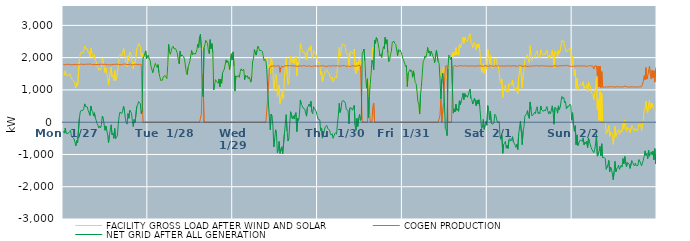
| Category | FACILITY GROSS LOAD AFTER WIND AND SOLAR | COGEN PRODUCTION | NET GRID AFTER ALL GENERATION |
|---|---|---|---|
|  Mon  1/27 | 1504 | 1786 | -282 |
|  Mon  1/27 | 1460 | 1801 | -341 |
|  Mon  1/27 | 1595 | 1778 | -183 |
|  Mon  1/27 | 1453 | 1793 | -340 |
|  Mon  1/27 | 1480 | 1795 | -315 |
|  Mon  1/27 | 1436 | 1794 | -358 |
|  Mon  1/27 | 1418 | 1795 | -377 |
|  Mon  1/27 | 1501 | 1792 | -291 |
|  Mon  1/27 | 1524 | 1777 | -253 |
|  Mon  1/27 | 1365 | 1798 | -433 |
|  Mon  1/27 | 1318 | 1782 | -464 |
|  Mon  1/27 | 1316 | 1795 | -479 |
|  Mon  1/27 | 1270 | 1786 | -516 |
|  Mon  1/27 | 1169 | 1783 | -614 |
|  Mon  1/27 | 1060 | 1790 | -730 |
|  Mon  1/27 | 1220 | 1790 | -570 |
|  Mon  1/27 | 1140 | 1777 | -637 |
|  Mon  1/27 | 1158 | 1802 | -644 |
|  Mon  1/27 | 1900 | 1782 | 118 |
|  Mon  1/27 | 2116 | 1803 | 313 |
|  Mon  1/27 | 2165 | 1803 | 362 |
|  Mon  1/27 | 2146 | 1793 | 353 |
|  Mon  1/27 | 2154 | 1788 | 366 |
|  Mon  1/27 | 2221 | 1800 | 421 |
|  Mon  1/27 | 2360 | 1792 | 568 |
|  Mon  1/27 | 2276 | 1791 | 485 |
|  Mon  1/27 | 2289 | 1799 | 490 |
|  Mon  1/27 | 2272 | 1801 | 471 |
|  Mon  1/27 | 2152 | 1792 | 360 |
|  Mon  1/27 | 2184 | 1797 | 387 |
|  Mon  1/27 | 2015 | 1806 | 209 |
|  Mon  1/27 | 2288 | 1787 | 501 |
|  Mon  1/27 | 2160 | 1789 | 371 |
|  Mon  1/27 | 2145 | 1806 | 339 |
|  Mon  1/27 | 1983 | 1783 | 200 |
|  Mon  1/27 | 2093 | 1801 | 292 |
|  Mon  1/27 | 1933 | 1787 | 146 |
|  Mon  1/27 | 1869 | 1809 | 60 |
|  Mon  1/27 | 1744 | 1783 | -39 |
|  Mon  1/27 | 1700 | 1793 | -93 |
|  Mon  1/27 | 1603 | 1784 | -181 |
|  Mon  1/27 | 1677 | 1795 | -118 |
|  Mon  1/27 | 1624 | 1798 | -174 |
|  Mon  1/27 | 1698 | 1776 | -78 |
|  Mon  1/27 | 1984 | 1792 | 192 |
|  Mon  1/27 | 1909 | 1789 | 120 |
|  Mon  1/27 | 1906 | 1793 | 113 |
|  Mon  1/27 | 1536 | 1787 | -251 |
|  Mon  1/27 | 1676 | 1794 | -118 |
|  Mon  1/27 | 1542 | 1802 | -260 |
|  Mon  1/27 | 1381 | 1776 | -395 |
|  Mon  1/27 | 1149 | 1784 | -635 |
|  Mon  1/27 | 1384 | 1777 | -393 |
|  Mon  1/27 | 1375 | 1792 | -417 |
|  Mon  1/27 | 1698 | 1780 | -82 |
|  Mon  1/27 | 1399 | 1792 | -393 |
|  Mon  1/27 | 1448 | 1790 | -342 |
|  Mon  1/27 | 1289 | 1790 | -501 |
|  Mon  1/27 | 1596 | 1792 | -196 |
|  Mon  1/27 | 1289 | 1802 | -513 |
|  Mon  1/27 | 1335 | 1797 | -462 |
|  Mon  1/27 | 1357 | 1783 | -426 |
|  Mon  1/27 | 1720 | 1793 | -73 |
|  Mon  1/27 | 1966 | 1783 | 183 |
|  Mon  1/27 | 2094 | 1780 | 314 |
|  Mon  1/27 | 2105 | 1800 | 305 |
|  Mon  1/27 | 2051 | 1784 | 267 |
|  Mon  1/27 | 2140 | 1795 | 345 |
|  Mon  1/27 | 2293 | 1800 | 493 |
|  Mon  1/27 | 2160 | 1797 | 363 |
|  Mon  1/27 | 1927 | 1801 | 126 |
|  Mon  1/27 | 1786 | 1802 | -16 |
|  Mon  1/27 | 1724 | 1786 | -62 |
|  Mon  1/27 | 2058 | 1790 | 268 |
|  Mon  1/27 | 1910 | 1789 | 121 |
|  Mon  1/27 | 2172 | 1801 | 371 |
|  Mon  1/27 | 2191 | 1795 | 396 |
|  Mon  1/27 | 2076 | 1799 | 277 |
|  Mon  1/27 | 1802 | 1769 | 33 |
|  Mon  1/27 | 1661 | 1794 | -133 |
|  Mon  1/27 | 1873 | 1790 | 83 |
|  Mon  1/27 | 1786 | 1796 | -10 |
|  Mon  1/27 | 1795 | 1801 | -6 |
|  Mon  1/27 | 2278 | 1788 | 490 |
|  Mon  1/27 | 2317 | 1781 | 536 |
|  Mon  1/27 | 2437 | 1796 | 641 |
|  Mon  1/27 | 2408 | 1791 | 617 |
|  Mon  1/27 | 2352 | 1784 | 568 |
|  Mon  1/27 | 2051 | 1787 | 264 |
|  Mon  1/27 | 2142 | 1788 | 354 |
|  Mon  1/27 | 1989 | 0 | 1989 |
|  Mon  1/27 | 2026 | 0 | 2026 |
|  Mon  1/27 | 2132 | 0 | 2132 |
|  Mon  1/27 | 2210 | 0 | 2210 |
|  Mon  1/27 | 1965 | 0 | 1965 |
|  Mon  1/27 | 1989 | 0 | 1989 |
|  Tue  1/28 | 2079 | 0 | 2079 |
|  Tue  1/28 | 1953 | 0 | 1953 |
|  Tue  1/28 | 1918 | 0 | 1918 |
|  Tue  1/28 | 1740 | 0 | 1740 |
|  Tue  1/28 | 1732 | 0 | 1732 |
|  Tue  1/28 | 1534 | 0 | 1534 |
|  Tue  1/28 | 1652 | 0 | 1652 |
|  Tue  1/28 | 1634 | 0 | 1634 |
|  Tue  1/28 | 1823 | 0 | 1823 |
|  Tue  1/28 | 1746 | 0 | 1746 |
|  Tue  1/28 | 1694 | 0 | 1694 |
|  Tue  1/28 | 1786 | 0 | 1786 |
|  Tue  1/28 | 1534 | 0 | 1534 |
|  Tue  1/28 | 1407 | 0 | 1407 |
|  Tue  1/28 | 1294 | 0 | 1294 |
|  Tue  1/28 | 1309 | 0 | 1309 |
|  Tue  1/28 | 1302 | 0 | 1302 |
|  Tue  1/28 | 1411 | 0 | 1411 |
|  Tue  1/28 | 1384 | 0 | 1384 |
|  Tue  1/28 | 1446 | 0 | 1446 |
|  Tue  1/28 | 1441 | 0 | 1441 |
|  Tue  1/28 | 1348 | 0 | 1348 |
|  Tue  1/28 | 1754 | 0 | 1754 |
|  Tue  1/28 | 2413 | 0 | 2413 |
|  Tue  1/28 | 2179 | 0 | 2179 |
|  Tue  1/28 | 2102 | 0 | 2102 |
|  Tue  1/28 | 2214 | 0 | 2214 |
|  Tue  1/28 | 2313 | 0 | 2313 |
|  Tue  1/28 | 2353 | 0 | 2353 |
|  Tue  1/28 | 2280 | 0 | 2280 |
|  Tue  1/28 | 2281 | 0 | 2281 |
|  Tue  1/28 | 2275 | 0 | 2275 |
|  Tue  1/28 | 2277 | 0 | 2277 |
|  Tue  1/28 | 2116 | 0 | 2116 |
|  Tue  1/28 | 1910 | 0 | 1910 |
|  Tue  1/28 | 1806 | 0 | 1806 |
|  Tue  1/28 | 2198 | 0 | 2198 |
|  Tue  1/28 | 2042 | 0 | 2042 |
|  Tue  1/28 | 2085 | 0 | 2085 |
|  Tue  1/28 | 2070 | 0 | 2070 |
|  Tue  1/28 | 2025 | 0 | 2025 |
|  Tue  1/28 | 1950 | 0 | 1950 |
|  Tue  1/28 | 1954 | 0 | 1954 |
|  Tue  1/28 | 1542 | 0 | 1542 |
|  Tue  1/28 | 1476 | 0 | 1476 |
|  Tue  1/28 | 1701 | 0 | 1701 |
|  Tue  1/28 | 1714 | 0 | 1714 |
|  Tue  1/28 | 1886 | 0 | 1886 |
|  Tue  1/28 | 2052 | 0 | 2052 |
|  Tue  1/28 | 2220 | 0 | 2220 |
|  Tue  1/28 | 2084 | 0 | 2084 |
|  Tue  1/28 | 2142 | 0 | 2142 |
|  Tue  1/28 | 2135 | 0 | 2135 |
|  Tue  1/28 | 2105 | 0 | 2105 |
|  Tue  1/28 | 2155 | 0 | 2155 |
|  Tue  1/28 | 2248 | 0 | 2248 |
|  Tue  1/28 | 2418 | 0 | 2418 |
|  Tue  1/28 | 2314 | 0 | 2314 |
|  Tue  1/28 | 2639 | 0 | 2639 |
|  Tue  1/28 | 2729 | 0 | 2729 |
|  Tue  1/28 | 2547 | 247 | 2300 |
|  Tue  1/28 | 2242 | 1146 | 1096 |
|  Tue  1/28 | 2290 | 1498 | 792 |
|  Tue  1/28 | 2317 | 0 | 2317 |
|  Tue  1/28 | 2391 | 0 | 2391 |
|  Tue  1/28 | 2537 | 0 | 2537 |
|  Tue  1/28 | 2512 | 0 | 2512 |
|  Tue  1/28 | 2445 | 0 | 2445 |
|  Tue  1/28 | 2199 | 0 | 2199 |
|  Tue  1/28 | 2120 | 0 | 2120 |
|  Tue  1/28 | 2559 | 0 | 2559 |
|  Tue  1/28 | 2274 | 0 | 2274 |
|  Tue  1/28 | 2437 | 0 | 2437 |
|  Tue  1/28 | 2160 | 0 | 2160 |
|  Tue  1/28 | 1002 | 0 | 1002 |
|  Tue  1/28 | 1148 | 0 | 1148 |
|  Tue  1/28 | 1318 | 0 | 1318 |
|  Tue  1/28 | 1275 | 0 | 1275 |
|  Tue  1/28 | 1234 | 0 | 1234 |
|  Tue  1/28 | 1201 | 0 | 1201 |
|  Tue  1/28 | 1341 | 0 | 1341 |
|  Tue  1/28 | 1093 | 0 | 1093 |
|  Tue  1/28 | 1337 | 0 | 1337 |
|  Tue  1/28 | 1206 | 0 | 1206 |
|  Tue  1/28 | 1527 | 0 | 1527 |
|  Tue  1/28 | 1527 | 0 | 1527 |
|  Tue  1/28 | 1647 | 0 | 1647 |
|  Tue  1/28 | 1622 | 0 | 1622 |
|  Tue  1/28 | 1932 | 0 | 1932 |
|  Tue  1/28 | 1847 | 0 | 1847 |
|  Tue  1/28 | 1905 | 0 | 1905 |
|  Tue  1/28 | 1803 | 0 | 1803 |
|  Tue  1/28 | 1626 | 0 | 1626 |
|  Tue  1/28 | 1602 | 0 | 1602 |
|  Tue  1/28 | 2117 | 0 | 2117 |
|  Tue  1/28 | 1936 | 0 | 1936 |
|  Wed  1/29 | 2178 | 0 | 2178 |
|  Wed  1/29 | 1743 | 0 | 1743 |
|  Wed  1/29 | 963 | 0 | 963 |
|  Wed  1/29 | 1437 | 0 | 1437 |
|  Wed  1/29 | 1397 | 0 | 1397 |
|  Wed  1/29 | 1374 | 0 | 1374 |
|  Wed  1/29 | 1450 | 0 | 1450 |
|  Wed  1/29 | 1388 | 0 | 1388 |
|  Wed  1/29 | 1566 | 0 | 1566 |
|  Wed  1/29 | 1654 | 0 | 1654 |
|  Wed  1/29 | 1595 | 0 | 1595 |
|  Wed  1/29 | 1610 | 0 | 1610 |
|  Wed  1/29 | 1638 | 0 | 1638 |
|  Wed  1/29 | 1317 | 0 | 1317 |
|  Wed  1/29 | 1456 | 0 | 1456 |
|  Wed  1/29 | 1405 | 0 | 1405 |
|  Wed  1/29 | 1441 | 0 | 1441 |
|  Wed  1/29 | 1350 | 0 | 1350 |
|  Wed  1/29 | 1403 | 0 | 1403 |
|  Wed  1/29 | 1397 | 0 | 1397 |
|  Wed  1/29 | 1241 | 0 | 1241 |
|  Wed  1/29 | 1414 | 0 | 1414 |
|  Wed  1/29 | 1864 | 0 | 1864 |
|  Wed  1/29 | 1971 | 0 | 1971 |
|  Wed  1/29 | 2249 | 0 | 2249 |
|  Wed  1/29 | 2230 | 0 | 2230 |
|  Wed  1/29 | 2078 | 0 | 2078 |
|  Wed  1/29 | 2227 | 0 | 2227 |
|  Wed  1/29 | 2359 | 0 | 2359 |
|  Wed  1/29 | 2347 | 0 | 2347 |
|  Wed  1/29 | 2217 | 0 | 2217 |
|  Wed  1/29 | 2236 | 0 | 2236 |
|  Wed  1/29 | 2221 | 0 | 2221 |
|  Wed  1/29 | 2190 | 0 | 2190 |
|  Wed  1/29 | 2053 | 0 | 2053 |
|  Wed  1/29 | 1903 | 0 | 1903 |
|  Wed  1/29 | 1950 | 0 | 1950 |
|  Wed  1/29 | 1909 | 0 | 1909 |
|  Wed  1/29 | 1983 | 344 | 1639 |
|  Wed  1/29 | 1819 | 742 | 1077 |
|  Wed  1/29 | 1676 | 1146 | 530 |
|  Wed  1/29 | 1780 | 1639 | 141 |
|  Wed  1/29 | 1493 | 1730 | -237 |
|  Wed  1/29 | 1992 | 1740 | 252 |
|  Wed  1/29 | 1914 | 1735 | 179 |
|  Wed  1/29 | 1617 | 1738 | -121 |
|  Wed  1/29 | 983 | 1751 | -768 |
|  Wed  1/29 | 1232 | 1747 | -515 |
|  Wed  1/29 | 1497 | 1731 | -234 |
|  Wed  1/29 | 1405 | 1750 | -345 |
|  Wed  1/29 | 797 | 1745 | -948 |
|  Wed  1/29 | 905 | 1743 | -838 |
|  Wed  1/29 | 1151 | 1749 | -598 |
|  Wed  1/29 | 579 | 1546 | -967 |
|  Wed  1/29 | 697 | 1689 | -992 |
|  Wed  1/29 | 972 | 1738 | -766 |
|  Wed  1/29 | 758 | 1737 | -979 |
|  Wed  1/29 | 715 | 1709 | -994 |
|  Wed  1/29 | 1391 | 1744 | -353 |
|  Wed  1/29 | 1672 | 1737 | -65 |
|  Wed  1/29 | 1981 | 1749 | 232 |
|  Wed  1/29 | 1467 | 1741 | -274 |
|  Wed  1/29 | 1164 | 1749 | -585 |
|  Wed  1/29 | 1241 | 1745 | -504 |
|  Wed  1/29 | 1687 | 1750 | -63 |
|  Wed  1/29 | 2058 | 1734 | 324 |
|  Wed  1/29 | 2061 | 1749 | 312 |
|  Wed  1/29 | 1852 | 1742 | 110 |
|  Wed  1/29 | 1944 | 1747 | 197 |
|  Wed  1/29 | 1825 | 1729 | 96 |
|  Wed  1/29 | 1981 | 1744 | 237 |
|  Wed  1/29 | 2047 | 1750 | 297 |
|  Wed  1/29 | 1439 | 1731 | -292 |
|  Wed  1/29 | 1856 | 1736 | 120 |
|  Wed  1/29 | 1790 | 1738 | 52 |
|  Wed  1/29 | 1962 | 1737 | 225 |
|  Wed  1/29 | 2438 | 1748 | 690 |
|  Wed  1/29 | 2312 | 1758 | 554 |
|  Wed  1/29 | 2249 | 1732 | 517 |
|  Wed  1/29 | 2170 | 1731 | 439 |
|  Wed  1/29 | 2199 | 1765 | 434 |
|  Wed  1/29 | 2146 | 1740 | 406 |
|  Wed  1/29 | 2019 | 1733 | 286 |
|  Wed  1/29 | 1923 | 1737 | 186 |
|  Wed  1/29 | 2197 | 1737 | 460 |
|  Wed  1/29 | 2233 | 1735 | 498 |
|  Wed  1/29 | 2314 | 1749 | 565 |
|  Wed  1/29 | 2223 | 1738 | 485 |
|  Wed  1/29 | 2371 | 1724 | 647 |
|  Wed  1/29 | 2053 | 1729 | 324 |
|  Wed  1/29 | 1993 | 1733 | 260 |
|  Wed  1/29 | 2224 | 1744 | 480 |
|  Wed  1/29 | 2164 | 1742 | 422 |
|  Wed  1/29 | 2134 | 1734 | 400 |
|  Wed  1/29 | 2079 | 1744 | 335 |
|  Wed  1/29 | 1950 | 1739 | 211 |
|  Thu  1/30 | 1831 | 1730 | 101 |
|  Thu  1/30 | 1871 | 1756 | 115 |
|  Thu  1/30 | 1818 | 1745 | 73 |
|  Thu  1/30 | 1475 | 1738 | -263 |
|  Thu  1/30 | 1563 | 1742 | -179 |
|  Thu  1/30 | 1250 | 1744 | -494 |
|  Thu  1/30 | 1365 | 1752 | -387 |
|  Thu  1/30 | 1448 | 1739 | -291 |
|  Thu  1/30 | 1578 | 1733 | -155 |
|  Thu  1/30 | 1571 | 1744 | -173 |
|  Thu  1/30 | 1627 | 1729 | -102 |
|  Thu  1/30 | 1545 | 1745 | -200 |
|  Thu  1/30 | 1522 | 1749 | -227 |
|  Thu  1/30 | 1495 | 1737 | -242 |
|  Thu  1/30 | 1377 | 1731 | -354 |
|  Thu  1/30 | 1339 | 1741 | -402 |
|  Thu  1/30 | 1396 | 1753 | -357 |
|  Thu  1/30 | 1244 | 1745 | -501 |
|  Thu  1/30 | 1309 | 1743 | -434 |
|  Thu  1/30 | 1379 | 1736 | -357 |
|  Thu  1/30 | 1420 | 1744 | -324 |
|  Thu  1/30 | 1365 | 1739 | -374 |
|  Thu  1/30 | 1708 | 1748 | -40 |
|  Thu  1/30 | 1962 | 1747 | 215 |
|  Thu  1/30 | 2320 | 1738 | 582 |
|  Thu  1/30 | 2044 | 1743 | 301 |
|  Thu  1/30 | 2151 | 1737 | 414 |
|  Thu  1/30 | 2385 | 1756 | 629 |
|  Thu  1/30 | 2423 | 1752 | 671 |
|  Thu  1/30 | 2430 | 1736 | 694 |
|  Thu  1/30 | 2392 | 1752 | 640 |
|  Thu  1/30 | 2317 | 1736 | 581 |
|  Thu  1/30 | 2125 | 1729 | 396 |
|  Thu  1/30 | 2154 | 1742 | 412 |
|  Thu  1/30 | 2100 | 1741 | 359 |
|  Thu  1/30 | 1695 | 1745 | -50 |
|  Thu  1/30 | 2169 | 1726 | 443 |
|  Thu  1/30 | 2193 | 1729 | 464 |
|  Thu  1/30 | 2180 | 1742 | 438 |
|  Thu  1/30 | 2116 | 1745 | 371 |
|  Thu  1/30 | 2151 | 1751 | 400 |
|  Thu  1/30 | 2267 | 1747 | 520 |
|  Thu  1/30 | 1628 | 1733 | -105 |
|  Thu  1/30 | 1504 | 1756 | -252 |
|  Thu  1/30 | 1854 | 1740 | 114 |
|  Thu  1/30 | 1607 | 1739 | -132 |
|  Thu  1/30 | 1883 | 1764 | 119 |
|  Thu  1/30 | 1976 | 1736 | 240 |
|  Thu  1/30 | 1794 | 1739 | 55 |
|  Thu  1/30 | 1832 | 1742 | 90 |
|  Thu  1/30 | 2138 | 0 | 2138 |
|  Thu  1/30 | 2181 | 0 | 2181 |
|  Thu  1/30 | 2266 | 0 | 2266 |
|  Thu  1/30 | 1905 | 0 | 1905 |
|  Thu  1/30 | 1365 | 0 | 1365 |
|  Thu  1/30 | 1055 | 0 | 1055 |
|  Thu  1/30 | 1343 | 0 | 1343 |
|  Thu  1/30 | 775 | 640 | 135 |
|  Thu  1/30 | 1279 | 493 | 786 |
|  Thu  1/30 | 1158 | 0 | 1158 |
|  Thu  1/30 | 1495 | 0 | 1495 |
|  Thu  1/30 | 1916 | 0 | 1916 |
|  Thu  1/30 | 2332 | 487 | 1845 |
|  Thu  1/30 | 2217 | 594 | 1623 |
|  Thu  1/30 | 2539 | 0 | 2539 |
|  Thu  1/30 | 2441 | 0 | 2441 |
|  Thu  1/30 | 2624 | 0 | 2624 |
|  Thu  1/30 | 2582 | 0 | 2582 |
|  Thu  1/30 | 2567 | 0 | 2567 |
|  Thu  1/30 | 2290 | 0 | 2290 |
|  Thu  1/30 | 2046 | 0 | 2046 |
|  Thu  1/30 | 2107 | 0 | 2107 |
|  Thu  1/30 | 2007 | 0 | 2007 |
|  Thu  1/30 | 2209 | 0 | 2209 |
|  Thu  1/30 | 2344 | 0 | 2344 |
|  Thu  1/30 | 2278 | 0 | 2278 |
|  Thu  1/30 | 2632 | 0 | 2632 |
|  Thu  1/30 | 2430 | 0 | 2430 |
|  Thu  1/30 | 2557 | 0 | 2557 |
|  Thu  1/30 | 2155 | 0 | 2155 |
|  Thu  1/30 | 1869 | 0 | 1869 |
|  Thu  1/30 | 1923 | 0 | 1923 |
|  Thu  1/30 | 2102 | 0 | 2102 |
|  Thu  1/30 | 2198 | 0 | 2198 |
|  Thu  1/30 | 2478 | 0 | 2478 |
|  Thu  1/30 | 2505 | 0 | 2505 |
|  Thu  1/30 | 2505 | 0 | 2505 |
|  Thu  1/30 | 2437 | 0 | 2437 |
|  Thu  1/30 | 2404 | 0 | 2404 |
|  Thu  1/30 | 2233 | 0 | 2233 |
|  Thu  1/30 | 2061 | 0 | 2061 |
|  Thu  1/30 | 2250 | 0 | 2250 |
|  Thu  1/30 | 2193 | 0 | 2193 |
|  Thu  1/30 | 2230 | 0 | 2230 |
|  Thu  1/30 | 2161 | 0 | 2161 |
|  Thu  1/30 | 2091 | 0 | 2091 |
|  Fri  1/31 | 1975 | 0 | 1975 |
|  Fri  1/31 | 1982 | 0 | 1982 |
|  Fri  1/31 | 1834 | 0 | 1834 |
|  Fri  1/31 | 1724 | 0 | 1724 |
|  Fri  1/31 | 1758 | 0 | 1758 |
|  Fri  1/31 | 1103 | 0 | 1103 |
|  Fri  1/31 | 1526 | 0 | 1526 |
|  Fri  1/31 | 1522 | 0 | 1522 |
|  Fri  1/31 | 1631 | 0 | 1631 |
|  Fri  1/31 | 1565 | 0 | 1565 |
|  Fri  1/31 | 1606 | 0 | 1606 |
|  Fri  1/31 | 1392 | 0 | 1392 |
|  Fri  1/31 | 1589 | 0 | 1589 |
|  Fri  1/31 | 1423 | 0 | 1423 |
|  Fri  1/31 | 1220 | 0 | 1220 |
|  Fri  1/31 | 1189 | 0 | 1189 |
|  Fri  1/31 | 958 | 0 | 958 |
|  Fri  1/31 | 635 | 0 | 635 |
|  Fri  1/31 | 565 | 0 | 565 |
|  Fri  1/31 | 253 | 0 | 253 |
|  Fri  1/31 | 884 | 0 | 884 |
|  Fri  1/31 | 1107 | 0 | 1107 |
|  Fri  1/31 | 1519 | 0 | 1519 |
|  Fri  1/31 | 1884 | 0 | 1884 |
|  Fri  1/31 | 1932 | 0 | 1932 |
|  Fri  1/31 | 2053 | 0 | 2053 |
|  Fri  1/31 | 2004 | 0 | 2004 |
|  Fri  1/31 | 2117 | 0 | 2117 |
|  Fri  1/31 | 2315 | 0 | 2315 |
|  Fri  1/31 | 2150 | 0 | 2150 |
|  Fri  1/31 | 2210 | 0 | 2210 |
|  Fri  1/31 | 2056 | 0 | 2056 |
|  Fri  1/31 | 2202 | 0 | 2202 |
|  Fri  1/31 | 2181 | 0 | 2181 |
|  Fri  1/31 | 2049 | 0 | 2049 |
|  Fri  1/31 | 1963 | 0 | 1963 |
|  Fri  1/31 | 1846 | 0 | 1846 |
|  Fri  1/31 | 1818 | 0 | 1818 |
|  Fri  1/31 | 2231 | 0 | 2231 |
|  Fri  1/31 | 2210 | 0 | 2210 |
|  Fri  1/31 | 1872 | 0 | 1872 |
|  Fri  1/31 | 1825 | 0 | 1825 |
|  Fri  1/31 | 1574 | 217 | 1357 |
|  Fri  1/31 | 1403 | 692 | 711 |
|  Fri  1/31 | 1327 | 0 | 1327 |
|  Fri  1/31 | 1520 | 0 | 1520 |
|  Fri  1/31 | 1714 | 575 | 1139 |
|  Fri  1/31 | 1743 | 1105 | 638 |
|  Fri  1/31 | 1532 | 1729 | -197 |
|  Fri  1/31 | 1505 | 1744 | -239 |
|  Fri  1/31 | 1339 | 1757 | -418 |
|  Fri  1/31 | 1649 | 0 | 1649 |
|  Fri  1/31 | 2079 | 0 | 2079 |
|  Fri  1/31 | 2028 | 0 | 2028 |
|  Fri  1/31 | 1938 | 0 | 1938 |
|  Fri  1/31 | 2020 | 0 | 2020 |
|  Fri  1/31 | 2150 | 988 | 1162 |
|  Fri  1/31 | 2013 | 1734 | 279 |
|  Fri  1/31 | 2170 | 1757 | 413 |
|  Fri  1/31 | 2077 | 1756 | 321 |
|  Fri  1/31 | 2306 | 1748 | 558 |
|  Fri  1/31 | 2098 | 1730 | 368 |
|  Fri  1/31 | 2159 | 1745 | 414 |
|  Fri  1/31 | 2077 | 1740 | 337 |
|  Fri  1/31 | 2419 | 1756 | 663 |
|  Fri  1/31 | 2302 | 1756 | 546 |
|  Fri  1/31 | 2397 | 1736 | 661 |
|  Fri  1/31 | 2500 | 1740 | 760 |
|  Fri  1/31 | 2629 | 1732 | 897 |
|  Fri  1/31 | 2439 | 1740 | 699 |
|  Fri  1/31 | 2633 | 1748 | 885 |
|  Fri  1/31 | 2546 | 1754 | 792 |
|  Fri  1/31 | 2569 | 1736 | 833 |
|  Fri  1/31 | 2504 | 1735 | 769 |
|  Fri  1/31 | 2591 | 1749 | 842 |
|  Fri  1/31 | 2692 | 1740 | 952 |
|  Fri  1/31 | 2747 | 1725 | 1022 |
|  Fri  1/31 | 2476 | 1742 | 734 |
|  Fri  1/31 | 2444 | 1748 | 696 |
|  Fri  1/31 | 2308 | 1746 | 562 |
|  Fri  1/31 | 2401 | 1749 | 652 |
|  Fri  1/31 | 2480 | 1736 | 744 |
|  Fri  1/31 | 2472 | 1735 | 737 |
|  Fri  1/31 | 2245 | 1736 | 509 |
|  Fri  1/31 | 2418 | 1737 | 681 |
|  Fri  1/31 | 2310 | 1750 | 560 |
|  Fri  1/31 | 2426 | 1732 | 694 |
|  Fri  1/31 | 2232 | 1744 | 488 |
|  Fri  1/31 | 2228 | 1744 | 484 |
|  Fri  1/31 | 1543 | 1743 | -200 |
|  Fri  1/31 | 1572 | 1741 | -169 |
|  Fri  1/31 | 1809 | 1725 | 84 |
|  Fri  1/31 | 1514 | 1738 | -224 |
|  Fri  1/31 | 1660 | 1755 | -95 |
|  Fri  1/31 | 1757 | 1726 | 31 |
|  Fri  1/31 | 1647 | 1741 | -94 |
|  Sat  2/1 | 2259 | 1747 | 512 |
|  Sat  2/1 | 2102 | 1731 | 371 |
|  Sat  2/1 | 1819 | 1749 | 70 |
|  Sat  2/1 | 2087 | 1747 | 340 |
|  Sat  2/1 | 1725 | 1741 | -16 |
|  Sat  2/1 | 1675 | 1741 | -66 |
|  Sat  2/1 | 1667 | 1737 | -70 |
|  Sat  2/1 | 1707 | 1731 | -24 |
|  Sat  2/1 | 1980 | 1733 | 247 |
|  Sat  2/1 | 1963 | 1750 | 213 |
|  Sat  2/1 | 1955 | 1742 | 213 |
|  Sat  2/1 | 1725 | 1734 | -9 |
|  Sat  2/1 | 1769 | 1766 | 3 |
|  Sat  2/1 | 1753 | 1737 | 16 |
|  Sat  2/1 | 1264 | 1732 | -468 |
|  Sat  2/1 | 1206 | 1744 | -538 |
|  Sat  2/1 | 1341 | 1746 | -405 |
|  Sat  2/1 | 773 | 1736 | -963 |
|  Sat  2/1 | 1041 | 1735 | -694 |
|  Sat  2/1 | 1094 | 1746 | -652 |
|  Sat  2/1 | 1147 | 1744 | -597 |
|  Sat  2/1 | 939 | 1744 | -805 |
|  Sat  2/1 | 1027 | 1741 | -714 |
|  Sat  2/1 | 925 | 1741 | -816 |
|  Sat  2/1 | 1202 | 1748 | -546 |
|  Sat  2/1 | 1226 | 1734 | -508 |
|  Sat  2/1 | 1149 | 1734 | -585 |
|  Sat  2/1 | 1188 | 1740 | -552 |
|  Sat  2/1 | 1296 | 1746 | -450 |
|  Sat  2/1 | 1121 | 1731 | -610 |
|  Sat  2/1 | 1136 | 1749 | -613 |
|  Sat  2/1 | 1028 | 1737 | -709 |
|  Sat  2/1 | 954 | 1738 | -784 |
|  Sat  2/1 | 1070 | 1751 | -681 |
|  Sat  2/1 | 883 | 1730 | -847 |
|  Sat  2/1 | 1385 | 1749 | -364 |
|  Sat  2/1 | 1371 | 1764 | -393 |
|  Sat  2/1 | 1774 | 1744 | 30 |
|  Sat  2/1 | 1441 | 1742 | -301 |
|  Sat  2/1 | 1053 | 1749 | -696 |
|  Sat  2/1 | 1454 | 1727 | -273 |
|  Sat  2/1 | 1599 | 1737 | -138 |
|  Sat  2/1 | 1928 | 1743 | 185 |
|  Sat  2/1 | 1981 | 1757 | 224 |
|  Sat  2/1 | 2001 | 1734 | 267 |
|  Sat  2/1 | 2104 | 1745 | 359 |
|  Sat  2/1 | 1923 | 1732 | 191 |
|  Sat  2/1 | 1850 | 1731 | 119 |
|  Sat  2/1 | 2370 | 1743 | 627 |
|  Sat  2/1 | 2123 | 1737 | 386 |
|  Sat  2/1 | 1918 | 1725 | 193 |
|  Sat  2/1 | 1925 | 1756 | 169 |
|  Sat  2/1 | 1999 | 1743 | 256 |
|  Sat  2/1 | 2047 | 1737 | 310 |
|  Sat  2/1 | 2024 | 1759 | 265 |
|  Sat  2/1 | 2172 | 1754 | 418 |
|  Sat  2/1 | 2218 | 1738 | 480 |
|  Sat  2/1 | 2004 | 1742 | 262 |
|  Sat  2/1 | 2044 | 1735 | 309 |
|  Sat  2/1 | 1998 | 1738 | 260 |
|  Sat  2/1 | 2246 | 1744 | 502 |
|  Sat  2/1 | 2136 | 1752 | 384 |
|  Sat  2/1 | 2123 | 1731 | 392 |
|  Sat  2/1 | 2085 | 1749 | 336 |
|  Sat  2/1 | 2128 | 1749 | 379 |
|  Sat  2/1 | 2081 | 1736 | 345 |
|  Sat  2/1 | 2106 | 1745 | 361 |
|  Sat  2/1 | 2233 | 1749 | 484 |
|  Sat  2/1 | 2087 | 1736 | 351 |
|  Sat  2/1 | 1981 | 1729 | 252 |
|  Sat  2/1 | 2082 | 1750 | 332 |
|  Sat  2/1 | 2003 | 1741 | 262 |
|  Sat  2/1 | 2112 | 1734 | 378 |
|  Sat  2/1 | 2234 | 1728 | 506 |
|  Sat  2/1 | 2044 | 1732 | 312 |
|  Sat  2/1 | 1686 | 1750 | -64 |
|  Sat  2/1 | 2198 | 1739 | 459 |
|  Sat  2/1 | 2199 | 1745 | 454 |
|  Sat  2/1 | 2155 | 1743 | 412 |
|  Sat  2/1 | 2018 | 1739 | 279 |
|  Sat  2/1 | 2236 | 1730 | 506 |
|  Sat  2/1 | 2131 | 1742 | 389 |
|  Sat  2/1 | 2205 | 1746 | 459 |
|  Sat  2/1 | 2408 | 1745 | 663 |
|  Sat  2/1 | 2538 | 1743 | 795 |
|  Sat  2/1 | 2485 | 1753 | 732 |
|  Sat  2/1 | 2520 | 1756 | 764 |
|  Sat  2/1 | 2351 | 1747 | 604 |
|  Sat  2/1 | 2366 | 1728 | 638 |
|  Sat  2/1 | 2177 | 1766 | 411 |
|  Sat  2/1 | 2220 | 1739 | 481 |
|  Sat  2/1 | 2230 | 1739 | 491 |
|  Sat  2/1 | 2239 | 1745 | 494 |
|  Sat  2/1 | 2299 | 1740 | 559 |
|  Sat  2/1 | 2256 | 1741 | 515 |
|  Sat  2/1 | 1787 | 1725 | 62 |
|  Sun  2/2 | 2035 | 1743 | 292 |
|  Sun  2/2 | 1646 | 1740 | -94 |
|  Sun  2/2 | 1442 | 1726 | -284 |
|  Sun  2/2 | 1627 | 1734 | -107 |
|  Sun  2/2 | 1049 | 1745 | -696 |
|  Sun  2/2 | 1354 | 1747 | -393 |
|  Sun  2/2 | 1013 | 1736 | -723 |
|  Sun  2/2 | 1097 | 1741 | -644 |
|  Sun  2/2 | 1153 | 1736 | -583 |
|  Sun  2/2 | 1196 | 1740 | -544 |
|  Sun  2/2 | 1213 | 1728 | -515 |
|  Sun  2/2 | 1141 | 1741 | -600 |
|  Sun  2/2 | 1255 | 1740 | -485 |
|  Sun  2/2 | 1046 | 1745 | -699 |
|  Sun  2/2 | 1108 | 1730 | -622 |
|  Sun  2/2 | 1065 | 1737 | -672 |
|  Sun  2/2 | 1161 | 1747 | -586 |
|  Sun  2/2 | 941 | 1728 | -787 |
|  Sun  2/2 | 1241 | 1737 | -496 |
|  Sun  2/2 | 1152 | 1752 | -600 |
|  Sun  2/2 | 1119 | 1736 | -617 |
|  Sun  2/2 | 955 | 1743 | -788 |
|  Sun  2/2 | 892 | 1744 | -852 |
|  Sun  2/2 | 861 | 1740 | -879 |
|  Sun  2/2 | 698 | 1643 | -945 |
|  Sun  2/2 | 882 | 1739 | -857 |
|  Sun  2/2 | 1068 | 1742 | -674 |
|  Sun  2/2 | 1373 | 1749 | -376 |
|  Sun  2/2 | 381 | 1434 | -1053 |
|  Sun  2/2 | 723 | 1739 | -1016 |
|  Sun  2/2 | 61 | 1096 | -1035 |
|  Sun  2/2 | 984 | 1736 | -752 |
|  Sun  2/2 | 29 | 1074 | -1045 |
|  Sun  2/2 | 899 | 1568 | -669 |
|  Sun  2/2 | -25 | 1085 | -1110 |
|  Sun  2/2 | 18 | 1096 | -1078 |
|  Sun  2/2 | 22 | 1084 | -1062 |
|  Sun  2/2 | -37 | 1099 | -1136 |
|  Sun  2/2 | -368 | 1091 | -1459 |
|  Sun  2/2 | -377 | 1087 | -1464 |
|  Sun  2/2 | -232 | 1095 | -1327 |
|  Sun  2/2 | -98 | 1087 | -1185 |
|  Sun  2/2 | -438 | 1095 | -1533 |
|  Sun  2/2 | -300 | 1092 | -1392 |
|  Sun  2/2 | -334 | 1100 | -1434 |
|  Sun  2/2 | -365 | 1086 | -1451 |
|  Sun  2/2 | -688 | 1095 | -1783 |
|  Sun  2/2 | -430 | 1096 | -1526 |
|  Sun  2/2 | -130 | 1084 | -1214 |
|  Sun  2/2 | -445 | 1091 | -1536 |
|  Sun  2/2 | -346 | 1098 | -1444 |
|  Sun  2/2 | -318 | 1088 | -1406 |
|  Sun  2/2 | -230 | 1099 | -1329 |
|  Sun  2/2 | -376 | 1086 | -1462 |
|  Sun  2/2 | -353 | 1085 | -1438 |
|  Sun  2/2 | -236 | 1100 | -1336 |
|  Sun  2/2 | -297 | 1097 | -1394 |
|  Sun  2/2 | -35 | 1091 | -1126 |
|  Sun  2/2 | -201 | 1091 | -1292 |
|  Sun  2/2 | 66 | 1131 | -1065 |
|  Sun  2/2 | 15 | 1100 | -1085 |
|  Sun  2/2 | -283 | 1100 | -1383 |
|  Sun  2/2 | -159 | 1094 | -1253 |
|  Sun  2/2 | -156 | 1096 | -1252 |
|  Sun  2/2 | -217 | 1081 | -1298 |
|  Sun  2/2 | -326 | 1106 | -1432 |
|  Sun  2/2 | -354 | 1098 | -1452 |
|  Sun  2/2 | -104 | 1087 | -1191 |
|  Sun  2/2 | -151 | 1096 | -1247 |
|  Sun  2/2 | -230 | 1090 | -1320 |
|  Sun  2/2 | -267 | 1085 | -1352 |
|  Sun  2/2 | -181 | 1086 | -1267 |
|  Sun  2/2 | -259 | 1092 | -1351 |
|  Sun  2/2 | -236 | 1104 | -1340 |
|  Sun  2/2 | -244 | 1092 | -1336 |
|  Sun  2/2 | -69 | 1088 | -1157 |
|  Sun  2/2 | -110 | 1094 | -1204 |
|  Sun  2/2 | -67 | 1112 | -1179 |
|  Sun  2/2 | -251 | 1100 | -1351 |
|  Sun  2/2 | -234 | 1105 | -1339 |
|  Sun  2/2 | 66 | 1250 | -1184 |
|  Sun  2/2 | 377 | 1439 | -1062 |
|  Sun  2/2 | 427 | 1316 | -889 |
|  Sun  2/2 | 658 | 1692 | -1034 |
|  Sun  2/2 | 369 | 1334 | -965 |
|  Sun  2/2 | 299 | 1434 | -1135 |
|  Sun  2/2 | 552 | 1423 | -871 |
|  Sun  2/2 | 679 | 1734 | -1055 |
|  Sun  2/2 | 405 | 1465 | -1060 |
|  Sun  2/2 | 416 | 1335 | -919 |
|  Sun  2/2 | 593 | 1612 | -1019 |
|  Sun  2/2 | 471 | 1368 | -897 |
|  Sun  2/2 | 426 | 1593 | -1167 |
|  Sun  2/2 | 420 | 1241 | -821 |
|  Sun  2/2 | 347 | 1638 | -1291 |
|  Sun  2/2 | 807 | 1735 | -928 |